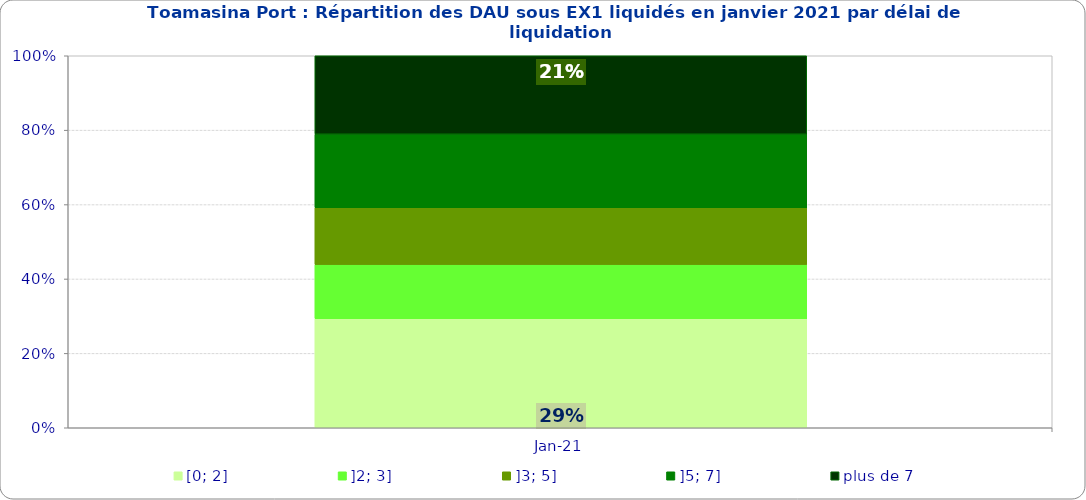
| Category | [0; 2] | ]2; 3] | ]3; 5] | ]5; 7] | plus de 7 |
|---|---|---|---|---|---|
| 2021-01-01 | 0.293 | 0.145 | 0.153 | 0.198 | 0.211 |